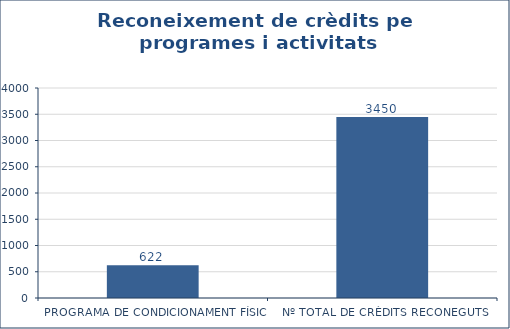
| Category | Series 0 |
|---|---|
| PROGRAMA DE CONDICIONAMENT FÍSIC | 622 |
| Nº TOTAL DE CRÈDITS RECONEGUTS | 3450 |